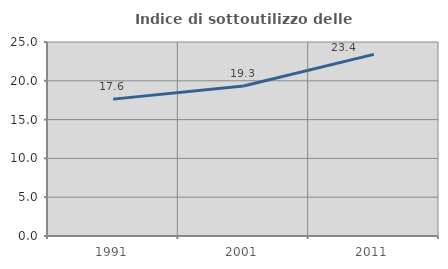
| Category | Indice di sottoutilizzo delle abitazioni  |
|---|---|
| 1991.0 | 17.638 |
| 2001.0 | 19.324 |
| 2011.0 | 23.403 |